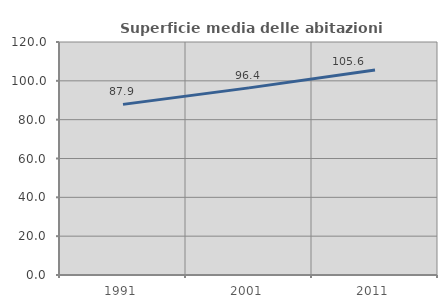
| Category | Superficie media delle abitazioni occupate |
|---|---|
| 1991.0 | 87.875 |
| 2001.0 | 96.371 |
| 2011.0 | 105.607 |